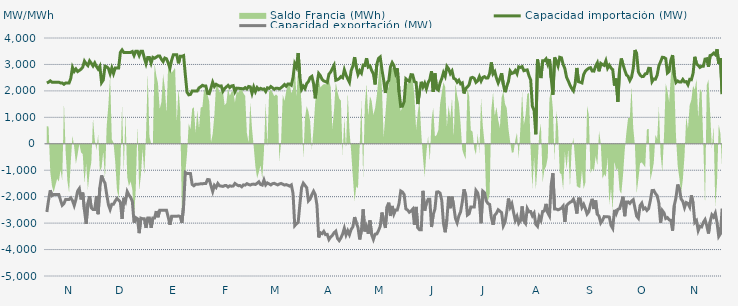
| Category | Capacidad importación (MW) | Capacidad exportación (MW) |
|---|---|---|
| 0 | 2300 | -2579.167 |
| 1900-01-01 | 2331.25 | -2131.25 |
| 1900-01-02 | 2379.167 | -1758.333 |
| 1900-01-03 | 2329.167 | -1960.417 |
| 1900-01-04 | 2329.167 | -1916.667 |
| 1900-01-05 | 2329.167 | -1916.667 |
| 1900-01-06 | 2329.167 | -1916.667 |
| 1900-01-07 | 2329.167 | -1918.75 |
| 1900-01-08 | 2300 | -2131.25 |
| 1900-01-09 | 2300 | -2325 |
| 1900-01-10 | 2250 | -2256.25 |
| 1900-01-11 | 2300 | -2104.167 |
| 1900-01-12 | 2300 | -2104.167 |
| 1900-01-13 | 2300 | -2104.167 |
| 1900-01-14 | 2475 | -2043.75 |
| 1900-01-15 | 2887.5 | -2150 |
| 1900-01-16 | 2737.5 | -2335.417 |
| 1900-01-17 | 2829.167 | -2106.25 |
| 1900-01-18 | 2732.25 | -1787 |
| 1900-01-19 | 2775 | -1691.667 |
| 1900-01-20 | 2820.833 | -2106.25 |
| 1900-01-21 | 2900 | -1845.833 |
| 1900-01-22 | 3125 | -2520.833 |
| 1900-01-23 | 3025 | -3033.333 |
| 1900-01-24 | 2956.25 | -2250 |
| 1900-01-25 | 3133.333 | -1987.5 |
| 1900-01-26 | 3045.833 | -2425 |
| 1900-01-27 | 2941.667 | -2485.417 |
| 1900-01-28 | 3058.333 | -2483.333 |
| 1900-01-29 | 2925 | -1975 |
| 1900-01-30 | 2825 | -2662.5 |
| 1900-01-31 | 2933.333 | -1658.333 |
| 1900-02-01 | 2312.5 | -1195.833 |
| 1900-02-02 | 2412.5 | -1375 |
| 1900-02-03 | 2933.333 | -1483.333 |
| 1900-02-04 | 2910.417 | -1912.5 |
| 1900-02-05 | 2850 | -2300 |
| 1900-02-06 | 2650 | -2483.333 |
| 1900-02-07 | 2866.667 | -2283.333 |
| 1900-02-08 | 2658.333 | -2283.333 |
| 1900-02-09 | 2866.667 | -2162.5 |
| 1900-02-10 | 2866.667 | -2066.667 |
| 1900-02-11 | 2866.667 | -2129.167 |
| 1900-02-12 | 3456.25 | -2204.167 |
| 1900-02-13 | 3550 | -2837.5 |
| 1900-02-14 | 3454.167 | -2041.667 |
| 1900-02-15 | 3454.167 | -2179.167 |
| 1900-02-16 | 3454.167 | -1808.333 |
| 1900-02-17 | 3454.167 | -1938.75 |
| 1900-02-18 | 3454.167 | -2029.167 |
| 1900-02-19 | 3487.5 | -2175 |
| 1900-02-20 | 3337.5 | -2983.333 |
| 1900-02-21 | 3500 | -2791.667 |
| 1900-02-22 | 3500 | -2833.333 |
| 1900-02-23 | 3337.5 | -3379.167 |
| 1900-02-24 | 3500 | -2812.5 |
| 1900-02-25 | 3500 | -2833.333 |
| 1900-02-26 | 3250 | -2837.5 |
| 1900-02-27 | 3028.25 | -3181.25 |
| 1900-02-28 | 3266.667 | -2808.333 |
| 1900-02-28 | 3266.667 | -2808.333 |
| 1900-03-01 | 3050 | -3181.25 |
| 1900-03-02 | 3266.667 | -2808.333 |
| 1900-03-03 | 3233.333 | -2808.333 |
| 1900-03-04 | 3275 | -2543.75 |
| 1900-03-05 | 3320.833 | -2779.167 |
| 1900-03-06 | 3320.833 | -2516.667 |
| 1900-03-07 | 3195.833 | -2516.667 |
| 1900-03-08 | 3108.333 | -2516.667 |
| 1900-03-09 | 3241.667 | -2516.667 |
| 1900-03-10 | 3212.5 | -2516.667 |
| 1900-03-11 | 3054.167 | -2775 |
| 1900-03-12 | 2862.5 | -3058.333 |
| 1900-03-13 | 3162.5 | -2741.667 |
| 1900-03-14 | 3366.667 | -2741.667 |
| 1900-03-15 | 3366.667 | -2741.667 |
| 1900-03-16 | 3366.667 | -2741.667 |
| 1900-03-17 | 3041.667 | -2729.167 |
| 1900-03-18 | 3306.25 | -2750 |
| 1900-03-19 | 3306.25 | -2991.667 |
| 1900-03-20 | 3333.333 | -2337.5 |
| 1900-03-21 | 2602.083 | -1083.333 |
| 1900-03-22 | 1950 | -1125 |
| 1900-03-23 | 1850 | -1125 |
| 1900-03-24 | 1866.667 | -1125 |
| 1900-03-25 | 2000 | -1537.5 |
| 1900-03-26 | 2000 | -1587.5 |
| 1900-03-27 | 2000 | -1529.167 |
| 1900-03-28 | 2000 | -1529.167 |
| 1900-03-29 | 2114.583 | -1525 |
| 1900-03-30 | 2154.167 | -1512.5 |
| 1900-03-31 | 2210.417 | -1516.667 |
| 1900-04-01 | 2183.333 | -1500 |
| 1900-04-02 | 2185.417 | -1500 |
| 1900-04-03 | 1906.25 | -1350 |
| 1900-04-04 | 1893.75 | -1358.333 |
| 1900-04-05 | 2104.167 | -1579.167 |
| 1900-04-06 | 2328.375 | -1804.167 |
| 1900-04-07 | 2166.667 | -1572.917 |
| 1900-04-08 | 2250 | -1650 |
| 1900-04-09 | 2212.5 | -1502.083 |
| 1900-04-10 | 2179.167 | -1589.583 |
| 1900-04-11 | 2187.5 | -1600 |
| 1900-04-12 | 1987.5 | -1612.5 |
| 1900-04-13 | 2091.667 | -1581.25 |
| 1900-04-14 | 2147.917 | -1581.25 |
| 1900-04-15 | 2208.333 | -1635.417 |
| 1900-04-16 | 2127.083 | -1589.583 |
| 1900-04-17 | 2185.417 | -1604.167 |
| 1900-04-18 | 2200 | -1597.917 |
| 1900-04-19 | 1966.667 | -1500 |
| 1900-04-20 | 2104.167 | -1545.833 |
| 1900-04-21 | 2102.083 | -1583.333 |
| 1900-04-22 | 2089.583 | -1581.25 |
| 1900-04-23 | 2085.417 | -1627.083 |
| 1900-04-24 | 2075 | -1554.167 |
| 1900-04-25 | 2122.917 | -1562.5 |
| 1900-04-26 | 2072.917 | -1508.333 |
| 1900-04-27 | 2166.667 | -1539.583 |
| 1900-04-28 | 2152.083 | -1560.417 |
| 1900-04-29 | 1908.333 | -1531.25 |
| 1900-04-30 | 2145.833 | -1525 |
| 1900-05-01 | 1972.917 | -1539.583 |
| 1900-05-02 | 2125 | -1491.667 |
| 1900-05-03 | 2050 | -1437.5 |
| 1900-05-04 | 2095.833 | -1539.583 |
| 1900-05-05 | 2062.5 | -1562.5 |
| 1900-05-06 | 2075 | -1368.75 |
| 1900-05-07 | 1979.167 | -1556.25 |
| 1900-05-08 | 2116.667 | -1481.25 |
| 1900-05-09 | 2093.75 | -1516.667 |
| 1900-05-10 | 2164.583 | -1556.25 |
| 1900-05-11 | 2116.667 | -1508.333 |
| 1900-05-12 | 2060.417 | -1493.75 |
| 1900-05-13 | 2102.083 | -1525 |
| 1900-05-14 | 2100 | -1556.25 |
| 1900-05-15 | 2075 | -1520.833 |
| 1900-05-16 | 2118.75 | -1500 |
| 1900-05-17 | 2177.083 | -1529.167 |
| 1900-05-18 | 2239.583 | -1562.5 |
| 1900-05-19 | 2177.083 | -1543.75 |
| 1900-05-20 | 2262.5 | -1568.75 |
| 1900-05-21 | 2260.417 | -1602.083 |
| 1900-05-22 | 2214.583 | -1556.25 |
| 1900-05-23 | 2506.25 | -1879.583 |
| 1900-05-24 | 3029.083 | -3096.667 |
| 1900-05-25 | 2897.083 | -3021.292 |
| 1900-05-26 | 3432.292 | -2977.083 |
| 1900-05-27 | 2507.25 | -2284.333 |
| 1900-05-28 | 2060.87 | -1658.696 |
| 1900-05-29 | 2179.167 | -1489.583 |
| 1900-05-30 | 2087.5 | -1575 |
| 1900-05-31 | 2277.417 | -1660.417 |
| 1900-06-01 | 2351.25 | -2160.417 |
| 1900-06-02 | 2503.458 | -2091.667 |
| 1900-06-03 | 2550 | -1920.833 |
| 1900-06-04 | 2281.458 | -1791.667 |
| 1900-06-05 | 1718.75 | -1920.833 |
| 1900-06-06 | 2254.5 | -2322.583 |
| 1900-06-07 | 2658.208 | -3541.417 |
| 1900-06-08 | 2574.708 | -3362.292 |
| 1900-06-09 | 2431.25 | -3398.958 |
| 1900-06-10 | 2374.5 | -3312.25 |
| 1900-06-11 | 2351.333 | -3435.417 |
| 1900-06-12 | 2317.583 | -3426.125 |
| 1900-06-13 | 2635.542 | -3620.708 |
| 1900-06-14 | 2711.542 | -3524.292 |
| 1900-06-15 | 2845.917 | -3464.708 |
| 1900-06-16 | 2969.417 | -3364.5 |
| 1900-06-17 | 2400.667 | -3304.667 |
| 1900-06-18 | 2423.292 | -3576.333 |
| 1900-06-19 | 2466.583 | -3661.208 |
| 1900-06-20 | 2539.583 | -3559.167 |
| 1900-06-21 | 2499 | -3412.958 |
| 1900-06-22 | 2794.042 | -3192.833 |
| 1900-06-23 | 2600.917 | -3446.833 |
| 1900-06-24 | 2454.333 | -3287.042 |
| 1900-06-25 | 2327 | -3437.333 |
| 1900-06-26 | 2764.875 | -3237.25 |
| 1900-06-27 | 2938.333 | -3142.542 |
| 1900-06-28 | 3277.667 | -2773.208 |
| 1900-06-29 | 2901.792 | -2987.042 |
| 1900-06-30 | 2620.125 | -3170.125 |
| 1900-07-01 | 2763 | -3616.833 |
| 1900-07-02 | 2671.542 | -3275.667 |
| 1900-07-03 | 2975.208 | -2481.333 |
| 1900-07-04 | 2963.292 | -3314.083 |
| 1900-07-05 | 3237.125 | -3127.25 |
| 1900-07-06 | 2903.125 | -3401.25 |
| 1900-07-07 | 2943.875 | -2899.917 |
| 1900-07-08 | 2767.417 | -3439.375 |
| 1900-07-09 | 2641.75 | -3616.75 |
| 1900-07-10 | 2244.417 | -3416.167 |
| 1900-07-11 | 3003.875 | -3408.875 |
| 1900-07-12 | 3226.875 | -3283.375 |
| 1900-07-13 | 3282.292 | -3121.542 |
| 1900-07-14 | 2800 | -2600 |
| 1900-07-15 | 2416.667 | -2918.75 |
| 1900-07-16 | 1920.333 | -3184.333 |
| 1900-07-17 | 2307.917 | -2385.917 |
| 1900-07-18 | 2390.792 | -2227.542 |
| 1900-07-19 | 2911.125 | -2730 |
| 1900-07-20 | 3070.25 | -2350.458 |
| 1900-07-21 | 2956.667 | -2656.375 |
| 1900-07-22 | 2670.833 | -2500 |
| 1900-07-23 | 2854.167 | -2500 |
| 1900-07-24 | 1964.208 | -2255.75 |
| 1900-07-25 | 1414.583 | -1785.417 |
| 1900-07-26 | 1420.833 | -1825 |
| 1900-07-27 | 1591.667 | -1922.917 |
| 1900-07-28 | 2454.167 | -2465 |
| 1900-07-29 | 2398.083 | -2503.583 |
| 1900-07-30 | 2366.667 | -2588.042 |
| 1900-07-31 | 2613.333 | -2542.833 |
| 1900-08-01 | 2604.917 | -2471 |
| 1900-08-02 | 2348.667 | -3059.875 |
| 1900-08-03 | 2320.833 | -2387.5 |
| 1900-08-04 | 1502.083 | -3177.542 |
| 1900-08-05 | 1981.25 | -3254.458 |
| 1900-08-06 | 2343.208 | -3252.458 |
| 1900-08-07 | 2147.917 | -1780 |
| 1900-08-08 | 2287.5 | -2525 |
| 1900-08-09 | 2076.167 | -2245.833 |
| 1900-08-10 | 2310.167 | -2100 |
| 1900-08-11 | 2432.875 | -2100 |
| 1900-08-12 | 2745.667 | -3148.25 |
| 1900-08-13 | 1962.5 | -2676.167 |
| 1900-08-14 | 2660.917 | -2469.583 |
| 1900-08-15 | 2079.167 | -1827.083 |
| 1900-08-16 | 2027.083 | -1816.667 |
| 1900-08-17 | 2300 | -1864.583 |
| 1900-08-18 | 2462.5 | -2143.75 |
| 1900-08-19 | 2691.458 | -3018.958 |
| 1900-08-20 | 2552.792 | -3345.333 |
| 1900-08-21 | 2923.125 | -2854.917 |
| 1900-08-22 | 2833.042 | -1993.167 |
| 1900-08-23 | 2653.792 | -2436 |
| 1900-08-24 | 2753.958 | -1999.792 |
| 1900-08-25 | 2473.333 | -2362.833 |
| 1900-08-26 | 2441.667 | -2824.792 |
| 1900-08-27 | 2328.458 | -2988.458 |
| 1900-08-28 | 2403.5 | -2728.542 |
| 1900-08-29 | 2265.917 | -2574.25 |
| 1900-08-30 | 2301.833 | -2201.042 |
| 1900-08-31 | 1903.333 | -1720.833 |
| 1900-09-01 | 2094.667 | -1947.917 |
| 1900-09-02 | 2147.917 | -2694.292 |
| 1900-09-03 | 2232.083 | -2646 |
| 1900-09-04 | 2487.5 | -2387.5 |
| 1900-09-05 | 2512.5 | -2387.5 |
| 1900-09-06 | 2472.917 | -2387.5 |
| 1900-09-07 | 2322 | -1764.625 |
| 1900-09-08 | 2377.5 | -1853.5 |
| 1900-09-09 | 2540.458 | -2160.917 |
| 1900-09-10 | 2372.875 | -3004.125 |
| 1900-09-11 | 2508.625 | -1791.125 |
| 1900-09-12 | 2539.208 | -1849.75 |
| 1900-09-13 | 2483.208 | -2155.417 |
| 1900-09-14 | 2490.375 | -2256.75 |
| 1900-09-15 | 2658.333 | -2291.667 |
| 1900-09-16 | 3076.5 | -2786.667 |
| 1900-09-17 | 2645.958 | -3061.667 |
| 1900-09-18 | 2731.458 | -2699.25 |
| 1900-09-19 | 2480.417 | -2627.458 |
| 1900-09-20 | 2300.833 | -2495 |
| 1900-09-21 | 2461.958 | -2546.167 |
| 1900-09-22 | 2667.458 | -2604.875 |
| 1900-09-23 | 2250.333 | -3105.542 |
| 1900-09-24 | 1952.083 | -2970.875 |
| 1900-09-25 | 2172 | -2579.417 |
| 1900-09-26 | 2356.083 | -2071.833 |
| 1900-09-27 | 2750.708 | -2400.667 |
| 1900-09-28 | 2658.875 | -2268.083 |
| 1900-09-29 | 2681 | -2596.625 |
| 1900-09-30 | 2770.75 | -2898.375 |
| 1900-10-01 | 2648.75 | -2746.625 |
| 1900-10-02 | 2910.167 | -3009.083 |
| 1900-10-03 | 2888.542 | -2911.458 |
| 1900-10-04 | 2919.917 | -2370.542 |
| 1900-10-05 | 2763.333 | -2914.917 |
| 1900-10-06 | 2782.917 | -3008.083 |
| 1900-10-07 | 2795.542 | -2448.708 |
| 1900-10-08 | 2576.25 | -2572.292 |
| 1900-10-09 | 2415.583 | -2563.292 |
| 1900-10-10 | 1418.917 | -2723.958 |
| 1900-10-11 | 1264.583 | -2622.458 |
| 1900-10-12 | 358.333 | -3044.542 |
| 1900-10-13 | 3186.917 | -3120.333 |
| 1900-10-14 | 2791.875 | -2763.458 |
| 1900-10-15 | 2484.583 | -2895.958 |
| 1900-10-16 | 3137.583 | -2556.25 |
| 1900-10-17 | 3137.5 | -2540.875 |
| 1900-10-18 | 3211 | -2273.125 |
| 1900-10-19 | 3012.542 | -2608.417 |
| 1900-10-20 | 3204.542 | -2728.708 |
| 1900-10-21 | 2487.333 | -1541.875 |
| 1900-10-22 | 1853.333 | -1112.917 |
| 1900-10-23 | 3263.917 | -2468.833 |
| 1900-10-24 | 3130.375 | -2468.375 |
| 1900-10-25 | 2944.542 | -2498.083 |
| 1900-10-26 | 3271.625 | -2470.667 |
| 1900-10-27 | 3250.667 | -2433.5 |
| 1900-10-28 | 3002.292 | -2354.917 |
| 1900-10-29 | 2842.625 | -2955.417 |
| 1900-10-30 | 2513.542 | -2337.375 |
| 1900-10-31 | 2375 | -2269.958 |
| 1900-11-01 | 2218.75 | -2210.458 |
| 1900-11-02 | 2093.75 | -2184.542 |
| 1900-11-03 | 2002.083 | -2097.042 |
| 1900-11-04 | 2264.583 | -2273.583 |
| 1900-11-05 | 2866.875 | -2637 |
| 1900-11-06 | 2346.958 | -2079.75 |
| 1900-11-07 | 2329.625 | -2082.083 |
| 1900-11-08 | 2302.458 | -2405.417 |
| 1900-11-09 | 2617.333 | -2289.667 |
| 1900-11-10 | 2750.042 | -2452.833 |
| 1900-11-11 | 2809.125 | -2657.958 |
| 1900-11-12 | 2857.375 | -2569.75 |
| 1900-11-13 | 2876.833 | -2291.708 |
| 1900-11-14 | 2750.708 | -2082.833 |
| 1900-11-15 | 2747.333 | -2466.667 |
| 1900-11-16 | 2937.458 | -2144.25 |
| 1900-11-17 | 3062.458 | -2672.417 |
| 1900-11-18 | 2740.417 | -2737.792 |
| 1900-11-19 | 3040.542 | -2994.125 |
| 1900-11-20 | 2995.708 | -2899.083 |
| 1900-11-21 | 2964.458 | -2754.583 |
| 1900-11-22 | 3138.792 | -2763.917 |
| 1900-11-23 | 2861.083 | -2758.667 |
| 1900-11-24 | 2973.75 | -2769.708 |
| 1900-11-25 | 2865 | -3086.792 |
| 1900-11-26 | 2805.417 | -3199.875 |
| 1900-11-27 | 2200 | -2500 |
| 1900-11-28 | 2468.25 | -2649 |
| 1900-11-29 | 1587.5 | -2475 |
| 1900-11-30 | 2818.542 | -2455.458 |
| 1900-12-01 | 3225.708 | -2239.583 |
| 1900-12-02 | 3000 | -2000 |
| 1900-12-03 | 2791.958 | -2738.25 |
| 1900-12-04 | 2607.167 | -2198.667 |
| 1900-12-05 | 2547.125 | -2197 |
| 1900-12-06 | 2393.292 | -2255.25 |
| 1900-12-07 | 2516 | -2169.167 |
| 1900-12-08 | 2853.667 | -2114.625 |
| 1900-12-09 | 3545.458 | -2428.042 |
| 1900-12-10 | 3402.833 | -2737.792 |
| 1900-12-11 | 2716.792 | -2816.833 |
| 1900-12-12 | 2599.417 | -2338.083 |
| 1900-12-13 | 2539.208 | -2246.333 |
| 1900-12-14 | 2547.375 | -2467.5 |
| 1900-12-15 | 2645.583 | -2424.333 |
| 1900-12-16 | 2654.167 | -2520.833 |
| 1900-12-17 | 2852.417 | -2448.375 |
| 1900-12-18 | 2850 | -2144.833 |
| 1900-12-19 | 2350 | -1768.75 |
| 1900-12-20 | 2450 | -1762.5 |
| 1900-12-21 | 2441.667 | -1881.25 |
| 1900-12-22 | 2597.917 | -1964.583 |
| 1900-12-23 | 2954.167 | -2250 |
| 1900-12-24 | 3102.32 | -2983.84 |
| 1900-12-25 | 3270.125 | -2524.167 |
| 1900-12-26 | 3263.958 | -2613.375 |
| 1900-12-27 | 3221.25 | -2826.5 |
| 1900-12-28 | 2678.333 | -2792.5 |
| 1900-12-29 | 2739.75 | -2875.042 |
| 1900-12-30 | 3161.75 | -2895.917 |
| 1900-12-31 | 3353.167 | -3283.208 |
| 1901-01-01 | 2604.75 | -2336.125 |
| 1901-01-02 | 2316.667 | -2037.25 |
| 1901-01-03 | 2377.083 | -1541.667 |
| 1901-01-04 | 2335.417 | -1708.333 |
| 1901-01-05 | 2333.083 | -2087.5 |
| 1901-01-06 | 2432.958 | -2175.833 |
| 1901-01-07 | 2341.417 | -2411.458 |
| 1901-01-08 | 2350 | -2224.167 |
| 1901-01-09 | 2233.333 | -2255.875 |
| 1901-01-10 | 2436.333 | -2388.333 |
| 1901-01-11 | 2422.917 | -1949.75 |
| 1901-01-12 | 2664.167 | -2243.25 |
| 1901-01-13 | 3289.125 | -2974.875 |
| 1901-01-14 | 3022.042 | -2905.375 |
| 1901-01-15 | 2967.917 | -3281.292 |
| 1901-01-16 | 2888.083 | -3117.75 |
| 1901-01-17 | 2932.458 | -3142.792 |
| 1901-01-18 | 2934.917 | -2973.208 |
| 1901-01-19 | 3202.583 | -2869.458 |
| 1901-01-20 | 3215.75 | -3094.417 |
| 1901-01-21 | 2915.5 | -3393.375 |
| 1901-01-22 | 3338.625 | -2938.583 |
| 1901-01-23 | 3362.542 | -2687.333 |
| 1901-01-24 | 3428.958 | -2770.5 |
| 1901-01-25 | 3372 | -2622.5 |
| 1901-01-26 | 3574.375 | -2972.542 |
| 1901-01-27 | 3028.917 | -3504.875 |
| 1901-01-28 | 3239.167 | -3400.917 |
| 1901-01-29 | 1878.75 | -2447.25 |